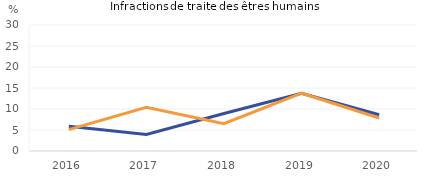
| Category | Affaires poursuivies pour une infraction avec au moins une victime mineure | Auteurs pousuivis pour une infraction avec  au moins une victime mineure |
|---|---|---|
| 2016.0 | 5.882 | 5.102 |
| 2017.0 | 3.922 | 10.427 |
| 2018.0 | 8.929 | 6.504 |
| 2019.0 | 13.75 | 13.761 |
| 2020.0 | 8.621 | 7.851 |